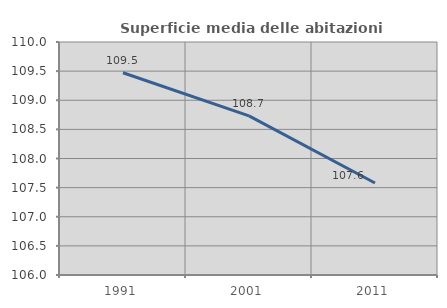
| Category | Superficie media delle abitazioni occupate |
|---|---|
| 1991.0 | 109.472 |
| 2001.0 | 108.731 |
| 2011.0 | 107.579 |